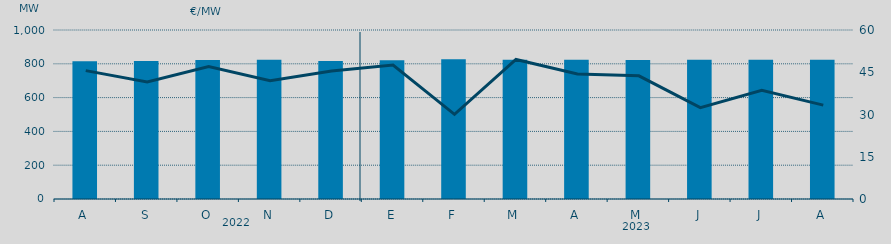
| Category | Potencia media a subir |
|---|---|
| A | 815.058 |
| S | 816.21 |
| O | 822.826 |
| N | 823.957 |
| D | 816.374 |
| E | 820.977 |
| F | 826.222 |
| M | 823.778 |
| A | 823.61 |
| M | 822.859 |
| J | 823.94 |
| J | 824.277 |
| A | 824.017 |